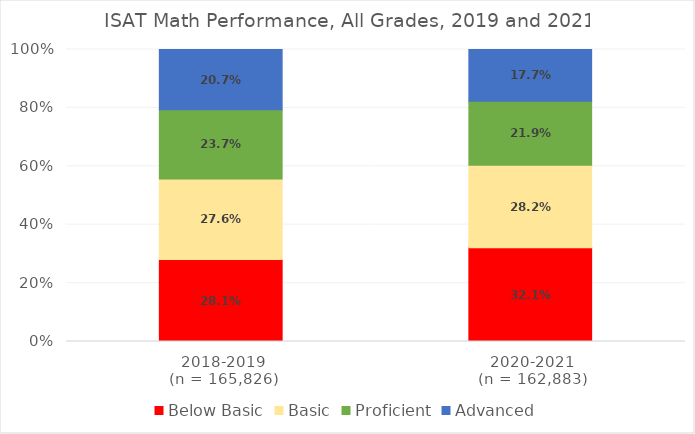
| Category | Below Basic | Basic | Proficient | Advanced |
|---|---|---|---|---|
| 2018-2019
(n = 165,826) | 0.281 | 0.276 | 0.237 | 0.207 |
| 2020-2021
(n = 162,883) | 0.321 | 0.282 | 0.219 | 0.177 |